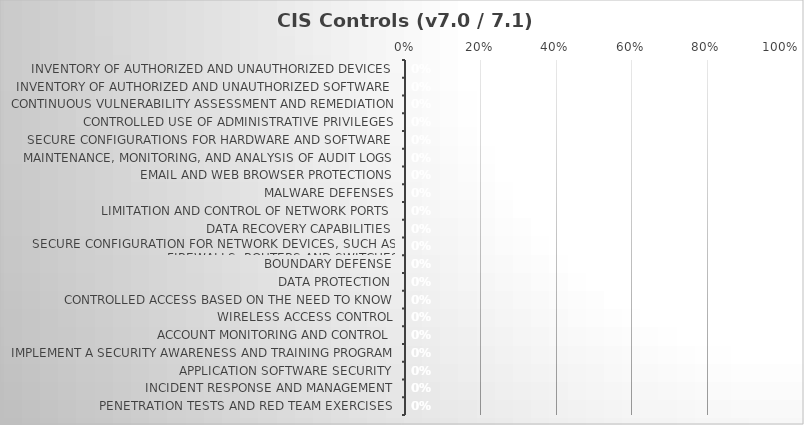
| Category | Implementation Score: |
|---|---|
| Inventory of Authorized and Unauthorized Devices | 0 |
| Inventory of Authorized and Unauthorized Software | 0 |
| Continuous Vulnerability Assessment and Remediation | 0 |
| Controlled Use of Administrative Privileges | 0 |
| Secure Configurations for Hardware and Software | 0 |
| Maintenance, Monitoring, and Analysis of Audit Logs | 0 |
| Email and Web Browser Protections | 0 |
| Malware Defenses | 0 |
| Limitation and Control of Network Ports | 0 |
| Data Recovery Capabilities | 0 |
| Secure Configuration for Network Devices, such as Firewalls, Routers and Switches | 0 |
| Boundary Defense | 0 |
| Data Protection | 0 |
| Controlled Access Based on the Need to Know | 0 |
| Wireless Access Control | 0 |
| Account Monitoring and Control | 0 |
| Implement a Security Awareness and Training Program | 0 |
| Application Software Security | 0 |
| Incident Response and Management | 0 |
| Penetration Tests and Red Team Exercises | 0 |